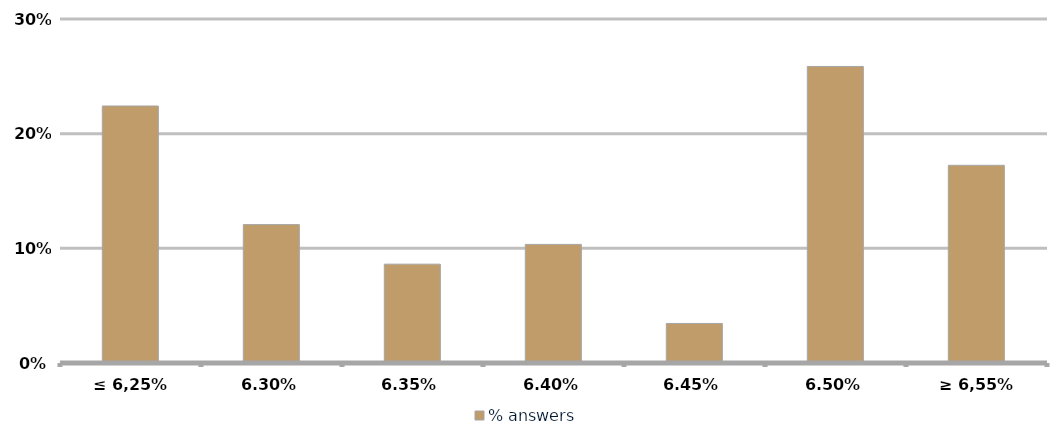
| Category | % answers |
|---|---|
| ≤ 6,25% | 0.224 |
| 6,30% | 0.121 |
| 6,35% | 0.086 |
| 6,40% | 0.103 |
| 6,45% | 0.034 |
| 6,50% | 0.259 |
| ≥ 6,55% | 0.172 |